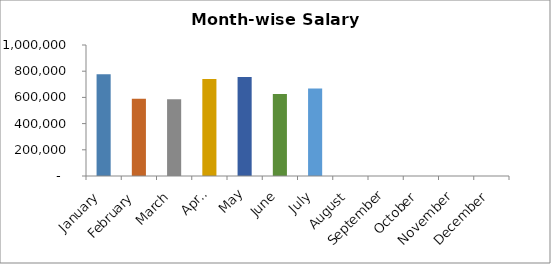
| Category | Salary |
|---|---|
| January | 777307 |
| February | 590235 |
| March | 585683 |
| April | 740995 |
| May | 756502 |
| June | 626126 |
| July | 668352 |
| August | 0 |
| September | 0 |
| October | 0 |
| November | 0 |
| December | 0 |